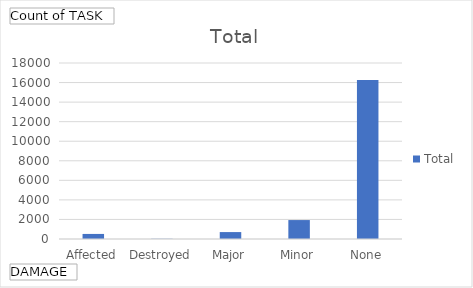
| Category | Total |
|---|---|
| Affected | 518 |
| Destroyed | 22 |
| Major | 708 |
| Minor | 1937 |
| None | 16260 |